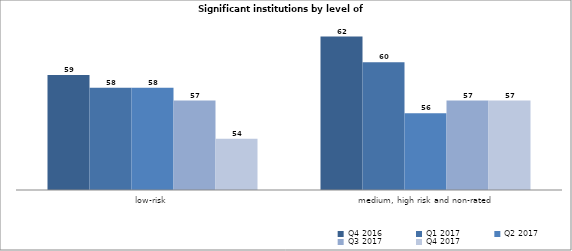
| Category | Q4 2016 | Q1 2017 | Q2 2017 | Q3 2017 | Q4 2017 |
|---|---|---|---|---|---|
| low-risk | 59 | 58 | 58 | 57 | 54 |
| medium, high risk and non-rated | 62 | 60 | 56 | 57 | 57 |